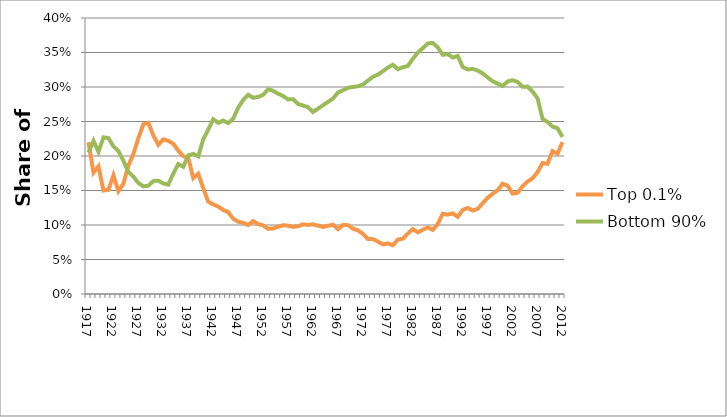
| Category | Top 0.1% | Bottom 90% |
|---|---|---|
| 1917.0 | 0.22 | 0.205 |
| 1918.0 | 0.176 | 0.222 |
| 1919.0 | 0.185 | 0.206 |
| 1920.0 | 0.15 | 0.227 |
| 1921.0 | 0.151 | 0.226 |
| 1922.0 | 0.172 | 0.214 |
| 1923.0 | 0.149 | 0.207 |
| 1924.0 | 0.16 | 0.193 |
| 1925.0 | 0.186 | 0.177 |
| 1926.0 | 0.203 | 0.17 |
| 1927.0 | 0.226 | 0.161 |
| 1928.0 | 0.246 | 0.156 |
| 1929.0 | 0.248 | 0.157 |
| 1930.0 | 0.23 | 0.164 |
| 1931.0 | 0.216 | 0.164 |
| 1932.0 | 0.224 | 0.16 |
| 1933.0 | 0.222 | 0.159 |
| 1934.0 | 0.218 | 0.175 |
| 1935.0 | 0.208 | 0.188 |
| 1936.0 | 0.2 | 0.184 |
| 1937.0 | 0.197 | 0.201 |
| 1938.0 | 0.168 | 0.203 |
| 1939.0 | 0.174 | 0.199 |
| 1940.0 | 0.153 | 0.224 |
| 1941.0 | 0.134 | 0.238 |
| 1942.0 | 0.13 | 0.253 |
| 1943.0 | 0.127 | 0.248 |
| 1944.0 | 0.122 | 0.251 |
| 1945.0 | 0.119 | 0.248 |
| 1946.0 | 0.109 | 0.254 |
| 1947.0 | 0.105 | 0.27 |
| 1948.0 | 0.103 | 0.281 |
| 1949.0 | 0.1 | 0.289 |
| 1950.0 | 0.106 | 0.284 |
| 1951.0 | 0.101 | 0.286 |
| 1952.0 | 0.099 | 0.289 |
| 1953.0 | 0.094 | 0.297 |
| 1954.0 | 0.095 | 0.294 |
| 1955.0 | 0.097 | 0.29 |
| 1956.0 | 0.1 | 0.287 |
| 1957.0 | 0.099 | 0.282 |
| 1958.0 | 0.097 | 0.282 |
| 1959.0 | 0.098 | 0.275 |
| 1960.0 | 0.101 | 0.273 |
| 1961.0 | 0.1 | 0.271 |
| 1962.0 | 0.101 | 0.264 |
| 1963.0 | 0.099 | 0.269 |
| 1964.0 | 0.097 | 0.273 |
| 1965.0 | 0.099 | 0.278 |
| 1966.0 | 0.1 | 0.283 |
| 1967.0 | 0.094 | 0.292 |
| 1968.0 | 0.1 | 0.295 |
| 1969.0 | 0.1 | 0.299 |
| 1970.0 | 0.095 | 0.3 |
| 1971.0 | 0.092 | 0.301 |
| 1972.0 | 0.087 | 0.303 |
| 1973.0 | 0.08 | 0.309 |
| 1974.0 | 0.08 | 0.315 |
| 1975.0 | 0.076 | 0.318 |
| 1976.0 | 0.072 | 0.323 |
| 1977.0 | 0.073 | 0.328 |
| 1978.0 | 0.071 | 0.332 |
| 1979.0 | 0.079 | 0.326 |
| 1980.0 | 0.08 | 0.329 |
| 1981.0 | 0.088 | 0.33 |
| 1982.0 | 0.094 | 0.341 |
| 1983.0 | 0.089 | 0.35 |
| 1984.0 | 0.093 | 0.356 |
| 1985.0 | 0.097 | 0.363 |
| 1986.0 | 0.093 | 0.364 |
| 1987.0 | 0.102 | 0.357 |
| 1988.0 | 0.116 | 0.347 |
| 1989.0 | 0.115 | 0.348 |
| 1990.0 | 0.117 | 0.343 |
| 1991.0 | 0.112 | 0.345 |
| 1992.0 | 0.122 | 0.329 |
| 1993.0 | 0.125 | 0.325 |
| 1994.0 | 0.121 | 0.326 |
| 1995.0 | 0.123 | 0.324 |
| 1996.0 | 0.132 | 0.32 |
| 1997.0 | 0.139 | 0.314 |
| 1998.0 | 0.145 | 0.308 |
| 1999.0 | 0.15 | 0.305 |
| 2000.0 | 0.16 | 0.302 |
| 2001.0 | 0.157 | 0.308 |
| 2002.0 | 0.145 | 0.31 |
| 2003.0 | 0.147 | 0.307 |
| 2004.0 | 0.156 | 0.3 |
| 2005.0 | 0.163 | 0.301 |
| 2006.0 | 0.168 | 0.293 |
| 2007.0 | 0.177 | 0.284 |
| 2008.0 | 0.19 | 0.254 |
| 2009.0 | 0.189 | 0.249 |
| 2010.0 | 0.207 | 0.243 |
| 2011.0 | 0.203 | 0.24 |
| 2012.0 | 0.22 | 0.228 |